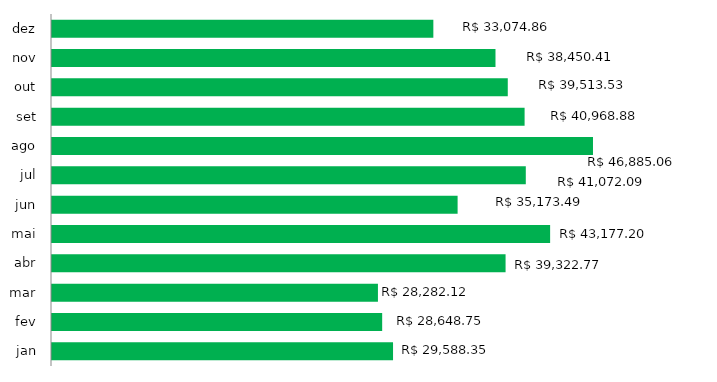
| Category | 2017 |
|---|---|
| jan | 29588.35 |
| fev | 28648.75 |
| mar | 28282.12 |
| abr | 39322.77 |
| mai | 43177.2 |
| jun | 35173.49 |
| jul | 41072.09 |
| ago | 46885.06 |
| set | 40968.88 |
| out | 39513.53 |
| nov | 38450.41 |
| dez | 33074.86 |